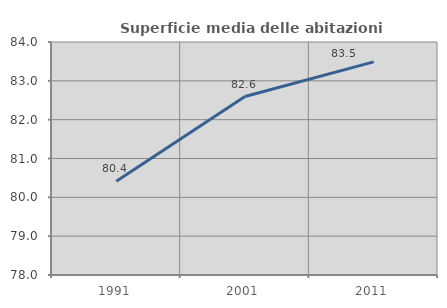
| Category | Superficie media delle abitazioni occupate |
|---|---|
| 1991.0 | 80.411 |
| 2001.0 | 82.595 |
| 2011.0 | 83.487 |